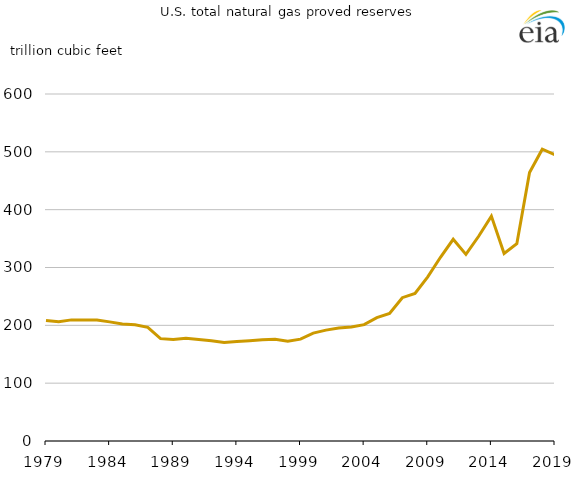
| Category | U.S. total natural gas proved reserves (trillion cubic feet) |
|---|---|
| 1979.0 | 208.335 |
| 1980.0 | 206.259 |
| 1981.0 | 209.434 |
| 1982.0 | 209.254 |
| 1983.0 | 209.046 |
| 1984.0 | 205.984 |
| 1985.0 | 202.202 |
| 1986.0 | 201.109 |
| 1987.0 | 196.428 |
| 1988.0 | 176.999 |
| 1989.0 | 175.428 |
| 1990.0 | 177.576 |
| 1991.0 | 175.325 |
| 1992.0 | 173.309 |
| 1993.0 | 170.49 |
| 1994.0 | 171.939 |
| 1995.0 | 173.476 |
| 1996.0 | 175.147 |
| 1997.0 | 175.721 |
| 1998.0 | 172.443 |
| 1999.0 | 176.159 |
| 2000.0 | 186.51 |
| 2001.0 | 191.743 |
| 2002.0 | 195.561 |
| 2003.0 | 197.145 |
| 2004.0 | 201.2 |
| 2005.0 | 213.308 |
| 2006.0 | 220.416 |
| 2007.0 | 247.789 |
| 2008.0 | 255.035 |
| 2009.0 | 283.879 |
| 2010.0 | 317.647 |
| 2011.0 | 348.809 |
| 2012.0 | 322.67 |
| 2013.0 | 353.994 |
| 2014.0 | 388.841 |
| 2015.0 | 324.303 |
| 2016.0 | 341.133 |
| 2017.0 | 464.292 |
| 2018.0 | 504.501 |
| 2019.0 | 494.911 |